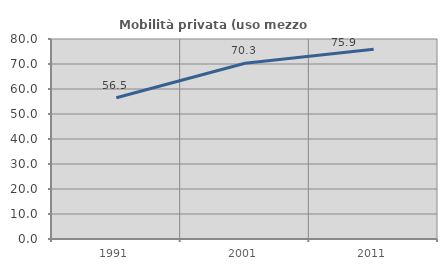
| Category | Mobilità privata (uso mezzo privato) |
|---|---|
| 1991.0 | 56.472 |
| 2001.0 | 70.307 |
| 2011.0 | 75.928 |